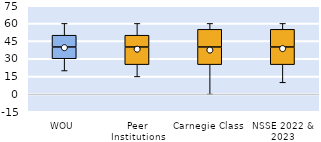
| Category | 25th | 50th | 75th |
|---|---|---|---|
| WOU | 30 | 10 | 10 |
| Peer Institutions | 25 | 15 | 10 |
| Carnegie Class | 25 | 15 | 15 |
| NSSE 2022 & 2023 | 25 | 15 | 15 |